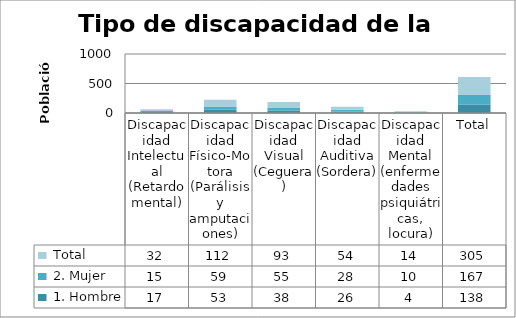
| Category |  1. Hombre |  2. Mujer |  Total |
|---|---|---|---|
| Discapacidad Intelectual (Retardo mental) | 17 | 15 | 32 |
| Discapacidad Físico-Motora (Parálisis y amputaciones) | 53 | 59 | 112 |
| Discapacidad Visual (Ceguera) | 38 | 55 | 93 |
| Discapacidad Auditiva (Sordera) | 26 | 28 | 54 |
| Discapacidad Mental (enfermedades psiquiátricas, locura) | 4 | 10 | 14 |
| Total | 138 | 167 | 305 |